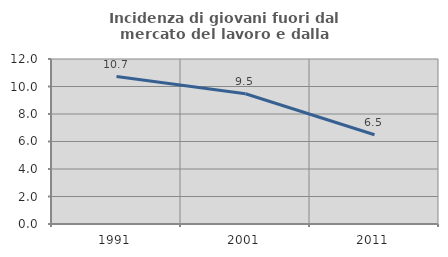
| Category | Incidenza di giovani fuori dal mercato del lavoro e dalla formazione  |
|---|---|
| 1991.0 | 10.727 |
| 2001.0 | 9.476 |
| 2011.0 | 6.488 |